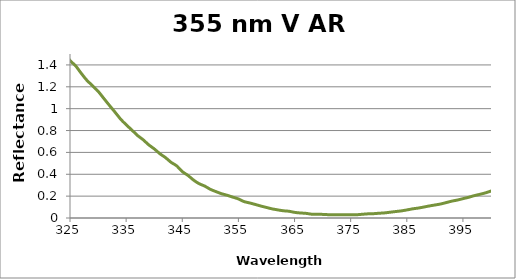
| Category | Reflectance (%) |
|---|---|
| 500.0 | 2.172 |
| 499.0 | 2.16 |
| 498.0 | 2.141 |
| 497.0 | 2.111 |
| 496.0 | 2.102 |
| 495.0 | 2.084 |
| 494.0 | 2.065 |
| 493.0 | 2.045 |
| 492.0 | 2.028 |
| 491.0 | 2.003 |
| 490.0 | 1.988 |
| 489.0 | 1.97 |
| 488.0 | 1.951 |
| 487.0 | 1.932 |
| 486.0 | 1.913 |
| 485.0 | 1.894 |
| 484.0 | 1.875 |
| 483.0 | 1.856 |
| 482.0 | 1.836 |
| 481.0 | 1.817 |
| 480.0 | 1.798 |
| 479.0 | 1.779 |
| 478.0 | 1.759 |
| 477.0 | 1.74 |
| 476.0 | 1.72 |
| 475.0 | 1.7 |
| 474.0 | 1.681 |
| 473.0 | 1.661 |
| 472.0 | 1.641 |
| 471.0 | 1.622 |
| 470.0 | 1.602 |
| 469.0 | 1.582 |
| 468.0 | 1.562 |
| 467.0 | 1.542 |
| 466.0 | 1.522 |
| 465.0 | 1.502 |
| 464.0 | 1.482 |
| 463.0 | 1.462 |
| 462.0 | 1.442 |
| 461.0 | 1.421 |
| 460.0 | 1.401 |
| 459.0 | 1.381 |
| 458.0 | 1.36 |
| 457.0 | 1.341 |
| 456.0 | 1.32 |
| 455.0 | 1.3 |
| 454.0 | 1.28 |
| 453.0 | 1.259 |
| 452.0 | 1.239 |
| 451.0 | 1.218 |
| 450.0 | 1.198 |
| 449.0 | 1.176 |
| 448.0 | 1.155 |
| 447.0 | 1.134 |
| 446.0 | 1.114 |
| 445.0 | 1.093 |
| 444.0 | 1.073 |
| 443.0 | 1.052 |
| 442.0 | 1.032 |
| 441.0 | 1.011 |
| 440.0 | 0.991 |
| 439.0 | 0.971 |
| 438.0 | 0.95 |
| 437.0 | 0.93 |
| 436.0 | 0.91 |
| 435.0 | 0.889 |
| 434.0 | 0.869 |
| 433.0 | 0.848 |
| 432.0 | 0.828 |
| 431.0 | 0.808 |
| 430.0 | 0.789 |
| 429.0 | 0.769 |
| 428.0 | 0.749 |
| 427.0 | 0.73 |
| 426.0 | 0.71 |
| 425.0 | 0.69 |
| 424.0 | 0.671 |
| 423.0 | 0.651 |
| 422.0 | 0.631 |
| 421.0 | 0.612 |
| 420.0 | 0.594 |
| 419.0 | 0.575 |
| 418.0 | 0.556 |
| 417.0 | 0.537 |
| 416.0 | 0.518 |
| 415.0 | 0.499 |
| 414.0 | 0.48 |
| 413.0 | 0.462 |
| 412.0 | 0.446 |
| 411.0 | 0.429 |
| 410.0 | 0.41 |
| 409.0 | 0.392 |
| 408.0 | 0.376 |
| 407.0 | 0.358 |
| 406.0 | 0.343 |
| 405.0 | 0.327 |
| 404.0 | 0.31 |
| 403.0 | 0.294 |
| 402.0 | 0.279 |
| 401.0 | 0.263 |
| 400.0 | 0.247 |
| 399.0 | 0.23 |
| 398.0 | 0.216 |
| 397.0 | 0.204 |
| 396.0 | 0.189 |
| 395.0 | 0.177 |
| 394.0 | 0.164 |
| 393.0 | 0.154 |
| 392.0 | 0.141 |
| 391.0 | 0.128 |
| 390.0 | 0.119 |
| 389.0 | 0.11 |
| 388.0 | 0.1 |
| 387.0 | 0.091 |
| 386.0 | 0.083 |
| 385.0 | 0.074 |
| 384.0 | 0.065 |
| 383.0 | 0.059 |
| 382.0 | 0.053 |
| 381.0 | 0.047 |
| 380.0 | 0.043 |
| 379.0 | 0.039 |
| 378.0 | 0.038 |
| 377.0 | 0.034 |
| 376.0 | 0.03 |
| 375.0 | 0.029 |
| 374.0 | 0.029 |
| 373.0 | 0.029 |
| 372.0 | 0.029 |
| 371.0 | 0.03 |
| 370.0 | 0.033 |
| 369.0 | 0.035 |
| 368.0 | 0.035 |
| 367.0 | 0.043 |
| 366.0 | 0.046 |
| 365.0 | 0.052 |
| 364.0 | 0.062 |
| 363.0 | 0.066 |
| 362.0 | 0.074 |
| 361.0 | 0.084 |
| 360.0 | 0.096 |
| 359.0 | 0.109 |
| 358.0 | 0.124 |
| 357.0 | 0.138 |
| 356.0 | 0.15 |
| 355.0 | 0.175 |
| 354.0 | 0.191 |
| 353.0 | 0.208 |
| 352.0 | 0.222 |
| 351.0 | 0.241 |
| 350.0 | 0.262 |
| 349.0 | 0.292 |
| 348.0 | 0.314 |
| 347.0 | 0.347 |
| 346.0 | 0.39 |
| 345.0 | 0.424 |
| 344.0 | 0.478 |
| 343.0 | 0.509 |
| 342.0 | 0.553 |
| 341.0 | 0.588 |
| 340.0 | 0.632 |
| 339.0 | 0.67 |
| 338.0 | 0.717 |
| 337.0 | 0.756 |
| 336.0 | 0.806 |
| 335.0 | 0.853 |
| 334.0 | 0.905 |
| 333.0 | 0.969 |
| 332.0 | 1.031 |
| 331.0 | 1.095 |
| 330.0 | 1.159 |
| 329.0 | 1.21 |
| 328.0 | 1.26 |
| 327.0 | 1.323 |
| 326.0 | 1.392 |
| 325.0 | 1.44 |
| 324.0 | 1.512 |
| 323.0 | 1.562 |
| 322.0 | 1.635 |
| 321.0 | 1.701 |
| 320.0 | 1.785 |
| 319.0 | 1.863 |
| 318.0 | 1.95 |
| 317.0 | 2.035 |
| 316.0 | 2.131 |
| 315.0 | 2.223 |
| 314.0 | 2.317 |
| 313.0 | 2.399 |
| 312.0 | 2.478 |
| 311.0 | 2.576 |
| 310.0 | 2.677 |
| 309.0 | 2.792 |
| 308.0 | 2.911 |
| 307.0 | 3.027 |
| 306.0 | 3.149 |
| 305.0 | 3.261 |
| 304.0 | 3.391 |
| 303.0 | 3.513 |
| 302.0 | 3.651 |
| 301.0 | 3.779 |
| 300.0 | 3.925 |
| 299.0 | 4.064 |
| 298.0 | 4.206 |
| 297.0 | 4.347 |
| 296.0 | 4.489 |
| 295.0 | 4.638 |
| 294.0 | 4.788 |
| 293.0 | 4.945 |
| 292.0 | 5.116 |
| 291.0 | 5.286 |
| 290.0 | 5.451 |
| 289.0 | 5.629 |
| 288.0 | 5.796 |
| 287.0 | 5.979 |
| 286.0 | 6.169 |
| 285.0 | 6.36 |
| 284.0 | 6.556 |
| 283.0 | 6.742 |
| 282.0 | 6.943 |
| 281.0 | 7.135 |
| 280.0 | 7.346 |
| 279.0 | 7.55 |
| 278.0 | 7.76 |
| 277.0 | 7.976 |
| 276.0 | 8.201 |
| 275.0 | 8.429 |
| 274.0 | 8.656 |
| 273.0 | 8.881 |
| 272.0 | 9.117 |
| 271.0 | 9.348 |
| 270.0 | 9.592 |
| 269.0 | 9.835 |
| 268.0 | 10.079 |
| 267.0 | 10.327 |
| 266.0 | 10.581 |
| 265.0 | 10.836 |
| 264.0 | 11.091 |
| 263.0 | 11.353 |
| 262.0 | 11.624 |
| 261.0 | 11.891 |
| 260.0 | 12.169 |
| 259.0 | 12.443 |
| 258.0 | 12.723 |
| 257.0 | 13.006 |
| 256.0 | 13.291 |
| 255.0 | 13.575 |
| 254.0 | 13.862 |
| 253.0 | 14.154 |
| 252.0 | 14.454 |
| 251.0 | 14.753 |
| 250.0 | 15.053 |
| 249.0 | 15.354 |
| 248.0 | 15.656 |
| 247.0 | 15.958 |
| 246.0 | 16.26 |
| 245.0 | 16.563 |
| 244.0 | 16.866 |
| 243.0 | 17.171 |
| 242.0 | 17.475 |
| 241.0 | 17.781 |
| 240.0 | 18.086 |
| 239.0 | 18.389 |
| 238.0 | 18.696 |
| 237.0 | 19.007 |
| 236.0 | 19.277 |
| 235.0 | 19.62 |
| 234.0 | 19.896 |
| 233.0 | 20.237 |
| 232.0 | 20.526 |
| 231.0 | 20.853 |
| 230.0 | 21.112 |
| 229.0 | 21.439 |
| 228.0 | 21.752 |
| 227.0 | 22.038 |
| 226.0 | 22.316 |
| 225.0 | 22.624 |
| 224.0 | 22.921 |
| 223.0 | 23.155 |
| 222.0 | 23.479 |
| 221.0 | 23.78 |
| 220.0 | 24.047 |
| 219.0 | 24.347 |
| 218.0 | 24.575 |
| 217.0 | 24.865 |
| 216.0 | 25.056 |
| 215.0 | 25.311 |
| 214.0 | 25.535 |
| 213.0 | 25.754 |
| 212.0 | 25.954 |
| 211.0 | 26.093 |
| 210.0 | 26.171 |
| 209.0 | 26.293 |
| 208.0 | 26.321 |
| 207.0 | 26.308 |
| 206.0 | 26.269 |
| 205.0 | 26.349 |
| 204.0 | 26.224 |
| 203.0 | 26.259 |
| 202.0 | 25.907 |
| 201.0 | 25.63 |
| 200.0 | 25.255 |